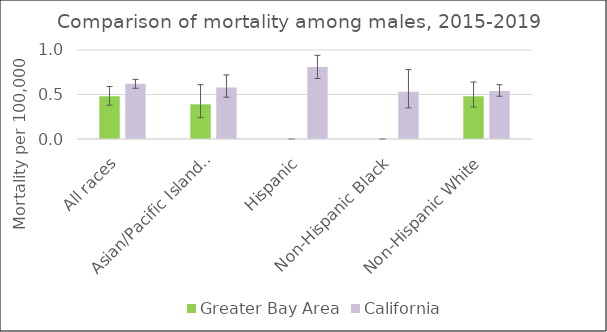
| Category | Greater Bay Area | California | US Mortality |
|---|---|---|---|
| All races | 0.48 | 0.62 |  |
| Asian/Pacific Islander | 0.39 | 0.58 |  |
| Hispanic | 0 | 0.81 |  |
| Non-Hispanic Black | 0 | 0.53 |  |
| Non-Hispanic White | 0.48 | 0.54 |  |